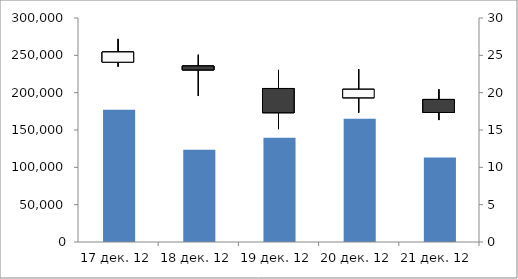
| Category | Объем торгов |
|---|---|
| 2012-12-17 | 177072 |
| 2012-12-18 | 123412 |
| 2012-12-19 | 139539 |
| 2012-12-20 | 165191 |
| 2012-12-21 | 113264 |